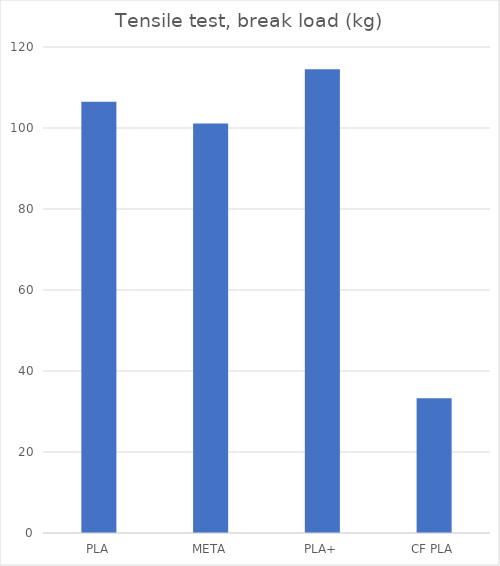
| Category | Average (kg) |
|---|---|
| PLA | 106.5 |
| META | 101.1 |
| PLA+ | 114.5 |
| CF PLA | 33.3 |